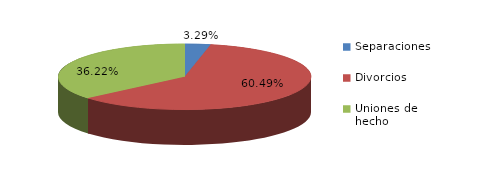
| Category | Series 0 |
|---|---|
| Separaciones | 27 |
| Divorcios | 496 |
| Uniones de hecho | 297 |